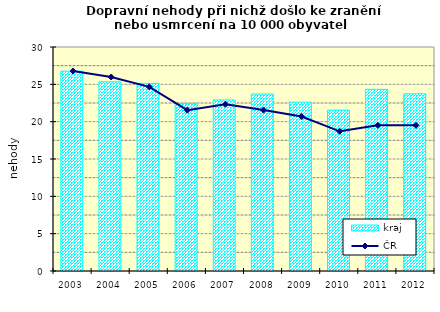
| Category | kraj |
|---|---|
| 2003.0 | 26.762 |
| 2004.0 | 25.34 |
| 2005.0 | 25.124 |
| 2006.0 | 22.429 |
| 2007.0 | 22.911 |
| 2008.0 | 23.704 |
| 2009.0 | 22.613 |
| 2010.0 | 21.548 |
| 2011.0 | 24.331 |
| 2012.0 | 23.735 |